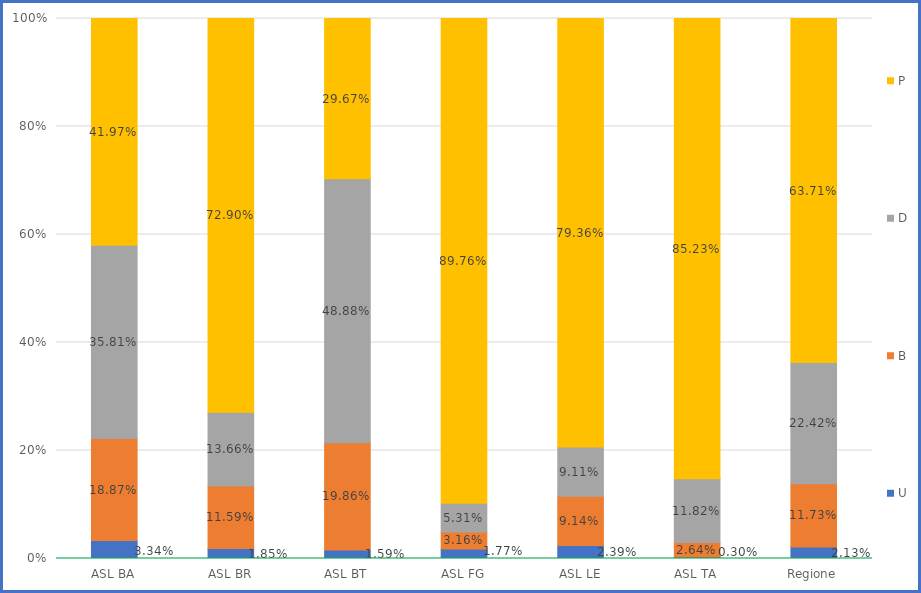
| Category | U | B | D | P |
|---|---|---|---|---|
| ASL BA | 0.033 | 0.189 | 0.358 | 0.42 |
| ASL BR | 0.019 | 0.116 | 0.137 | 0.729 |
| ASL BT | 0.016 | 0.199 | 0.489 | 0.297 |
| ASL FG | 0.018 | 0.032 | 0.053 | 0.898 |
| ASL LE | 0.024 | 0.091 | 0.091 | 0.794 |
| ASL TA | 0.003 | 0.026 | 0.118 | 0.852 |
| Regione | 0.021 | 0.117 | 0.224 | 0.637 |